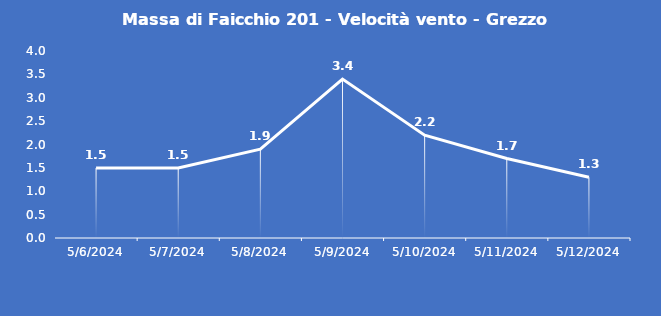
| Category | Massa di Faicchio 201 - Velocità vento - Grezzo (m/s) |
|---|---|
| 5/6/24 | 1.5 |
| 5/7/24 | 1.5 |
| 5/8/24 | 1.9 |
| 5/9/24 | 3.4 |
| 5/10/24 | 2.2 |
| 5/11/24 | 1.7 |
| 5/12/24 | 1.3 |